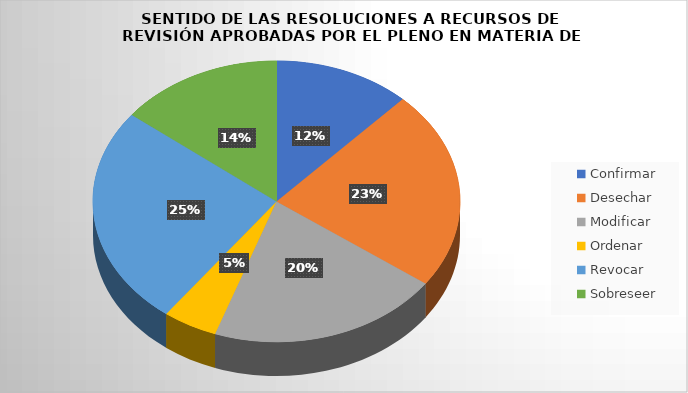
| Category | Series 0 |
|---|---|
| Confirmar | 10 |
| Desechar | 19 |
| Modificar | 17 |
| Ordenar | 4 |
| Revocar | 21 |
| Sobreseer | 12 |